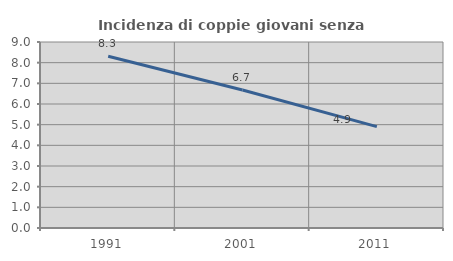
| Category | Incidenza di coppie giovani senza figli |
|---|---|
| 1991.0 | 8.312 |
| 2001.0 | 6.676 |
| 2011.0 | 4.904 |